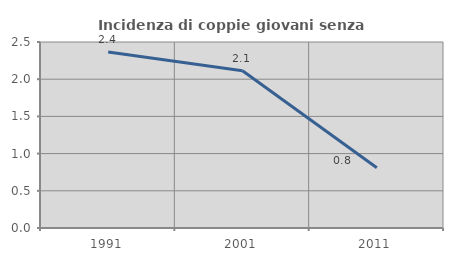
| Category | Incidenza di coppie giovani senza figli |
|---|---|
| 1991.0 | 2.366 |
| 2001.0 | 2.113 |
| 2011.0 | 0.809 |